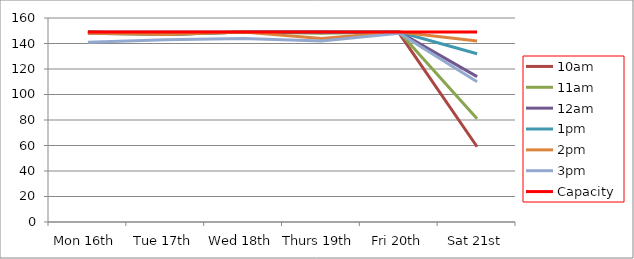
| Category | 9am | 10am | 11am | 12am | 1pm | 2pm | 3pm | 4pm | 5pm | Capacity |
|---|---|---|---|---|---|---|---|---|---|---|
| Mon 16th |  | 149 | 149 | 149 | 148 | 148 | 141 |  |  | 149 |
| Tue 17th |  | 147 | 147 | 149 | 147 | 147 | 143 |  |  | 149 |
| Wed 18th |  | 149 | 149 | 149 | 149 | 149 | 144 |  |  | 149 |
| Thurs 19th |  | 149 | 148 | 149 | 149 | 144 | 142 |  |  | 149 |
| Fri 20th |  | 148 | 149 | 149 | 149 | 149 | 148 |  |  | 149 |
| Sat 21st |  | 59 | 81 | 114 | 132 | 142 | 110 |  |  | 149 |